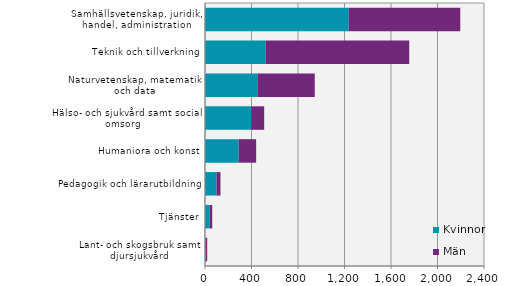
| Category | Kvinnor | Män |
|---|---|---|
| Samhällsvetenskap, juridik, handel, administration | 1237 | 959 |
| Teknik och tillverkning | 521 | 1236 |
| Naturvetenskap, matematik och data | 450 | 494 |
| Hälso- och sjukvård samt social omsorg   | 397 | 112 |
| Humaniora och konst | 289 | 151 |
| Pedagogik och lärarutbildning | 99 | 34 |
| Tjänster | 40 | 22 |
| Lant- och skogsbruk samt djursjukvård | 9 | 10 |